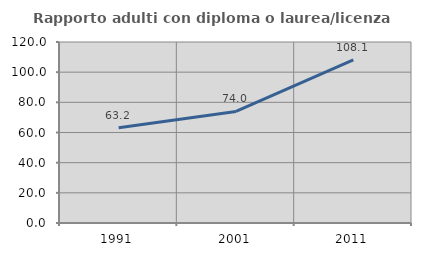
| Category | Rapporto adulti con diploma o laurea/licenza media  |
|---|---|
| 1991.0 | 63.222 |
| 2001.0 | 73.978 |
| 2011.0 | 108.15 |